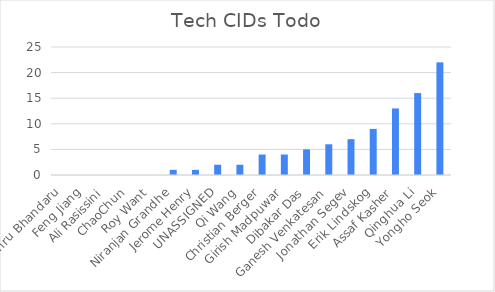
| Category | Series 0 |
|---|---|
| Nehru Bhandaru | 0 |
| Feng Jiang | 0 |
| Ali Rasissini | 0 |
| ChaoChun | 0 |
| Roy Want | 0 |
| Niranjan Grandhe | 1 |
| Jerome Henry | 1 |
| UNASSIGNED | 2 |
| Qi Wang | 2 |
| Christian Berger | 4 |
| Girish Madpuwar | 4 |
| Dibakar Das | 5 |
| Ganesh Venkatesan | 6 |
| Jonathan Segev | 7 |
| Erik Lindskog | 9 |
| Assaf Kasher | 13 |
| Qinghua Li | 16 |
| Yongho Seok | 22 |